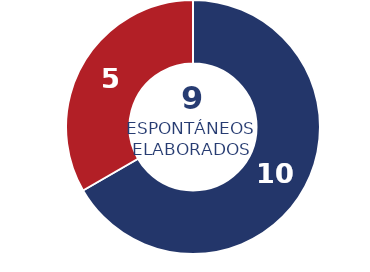
| Category | Series 0 |
|---|---|
| Física | 10 |
| Jurídica | 5 |